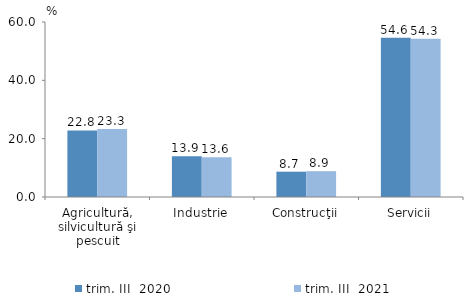
| Category | trim. III  2020 | trim. III  2021 |
|---|---|---|
| Agricultură, silvicultură şi pescuit | 22.82 | 23.282 |
| Industrie | 13.93 | 13.602 |
| Construcţii | 8.679 | 8.856 |
| Servicii | 54.572 | 54.26 |